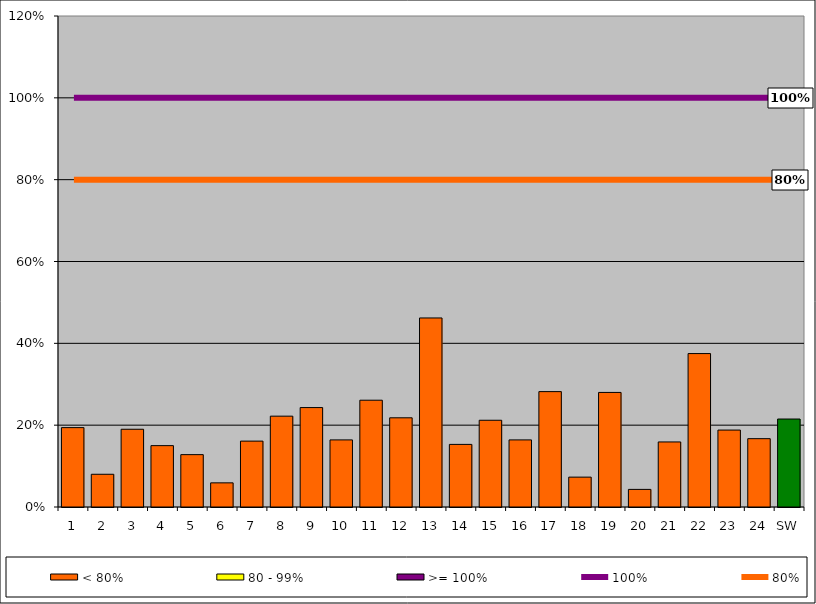
| Category | < 80% | 80 - 99% | >= 100% |
|---|---|---|---|
| 1 | 0.194 | 0 | 0 |
| 2 | 0.08 | 0 | 0 |
| 3 | 0.19 | 0 | 0 |
| 4 | 0.15 | 0 | 0 |
| 5 | 0.128 | 0 | 0 |
| 6 | 0.059 | 0 | 0 |
| 7 | 0.161 | 0 | 0 |
| 8 | 0.222 | 0 | 0 |
| 9 | 0.243 | 0 | 0 |
| 10 | 0.164 | 0 | 0 |
| 11 | 0.261 | 0 | 0 |
| 12 | 0.218 | 0 | 0 |
| 13 | 0.462 | 0 | 0 |
| 14 | 0.153 | 0 | 0 |
| 15 | 0.212 | 0 | 0 |
| 16 | 0.164 | 0 | 0 |
| 17 | 0.282 | 0 | 0 |
| 18 | 0.073 | 0 | 0 |
| 19 | 0.28 | 0 | 0 |
| 20 | 0.043 | 0 | 0 |
| 21 | 0.159 | 0 | 0 |
| 22 | 0.375 | 0 | 0 |
| 23 | 0.188 | 0 | 0 |
| 24 | 0.167 | 0 | 0 |
| SW | 0.215 | 0 | 0 |